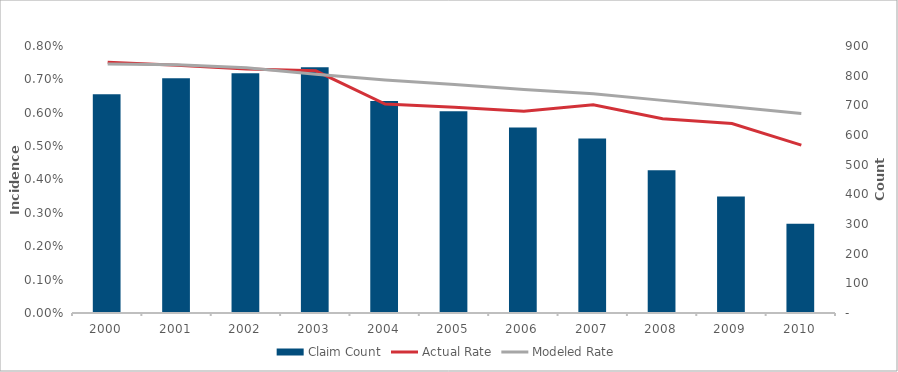
| Category | Claim Count |
|---|---|
| 2000.0 | 737 |
| 2001.0 | 791 |
| 2002.0 | 808 |
| 2003.0 | 828 |
| 2004.0 | 715 |
| 2005.0 | 680 |
| 2006.0 | 625 |
| 2007.0 | 588 |
| 2008.0 | 481 |
| 2009.0 | 393 |
| 2010.0 | 301 |